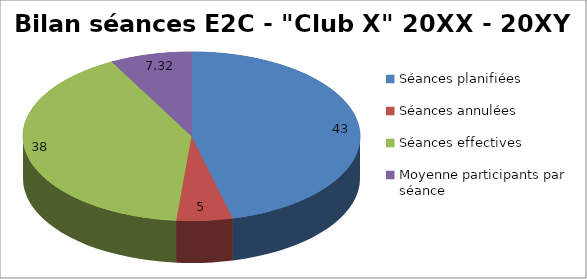
| Category | Bilan séances E2C - "Club X" 20XX - 20XY |
|---|---|
| Séances planifiées | 43 |
| Séances annulées | 5 |
| Séances effectives | 38 |
| Moyenne participants par séance | 7.316 |